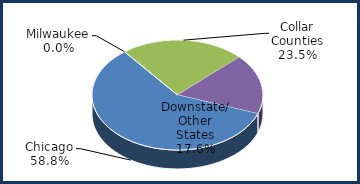
| Category | Series 0 |
|---|---|
| Chicago | 0.588 |
| Milwaukee | 0 |
| Collar Counties | 0.235 |
| Downstate/ Other States | 0.176 |